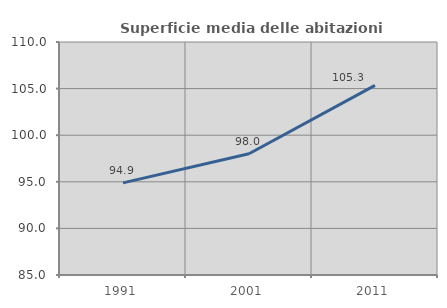
| Category | Superficie media delle abitazioni occupate |
|---|---|
| 1991.0 | 94.886 |
| 2001.0 | 98.004 |
| 2011.0 | 105.347 |